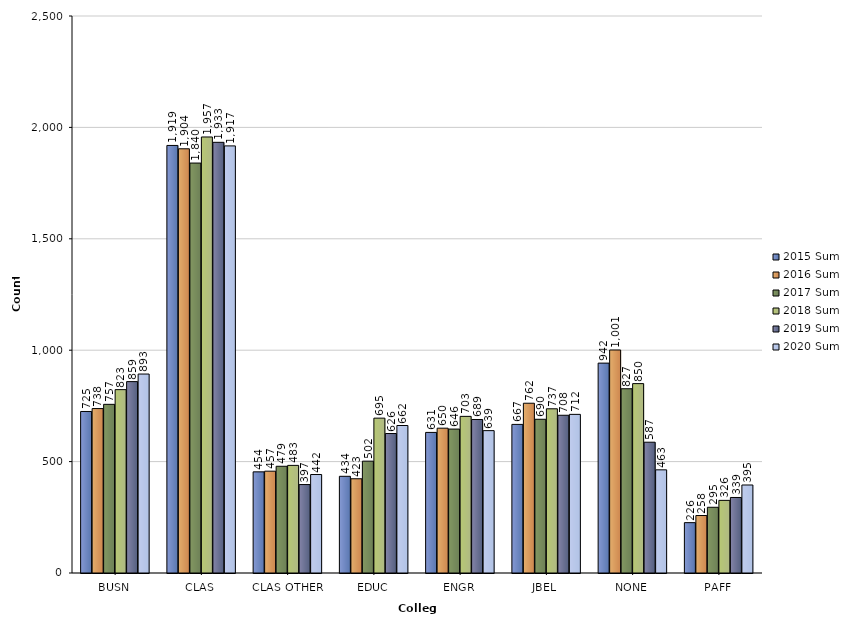
| Category | 2015 Sum | 2016 Sum | 2017 Sum | 2018 Sum | 2019 Sum | 2020 Sum |
|---|---|---|---|---|---|---|
| BUSN | 725 | 738 | 757 | 823 | 859 | 893 |
| CLAS | 1919 | 1904 | 1840 | 1957 | 1933 | 1917 |
| CLAS OTHER | 454 | 457 | 479 | 483 | 397 | 442 |
| EDUC | 434 | 423 | 502 | 695 | 626 | 662 |
| ENGR | 631 | 650 | 646 | 703 | 689 | 639 |
| JBEL | 667 | 762 | 690 | 737 | 708 | 712 |
| NONE | 942 | 1001 | 827 | 850 | 587 | 463 |
| PAFF | 226 | 258 | 295 | 326 | 339 | 395 |